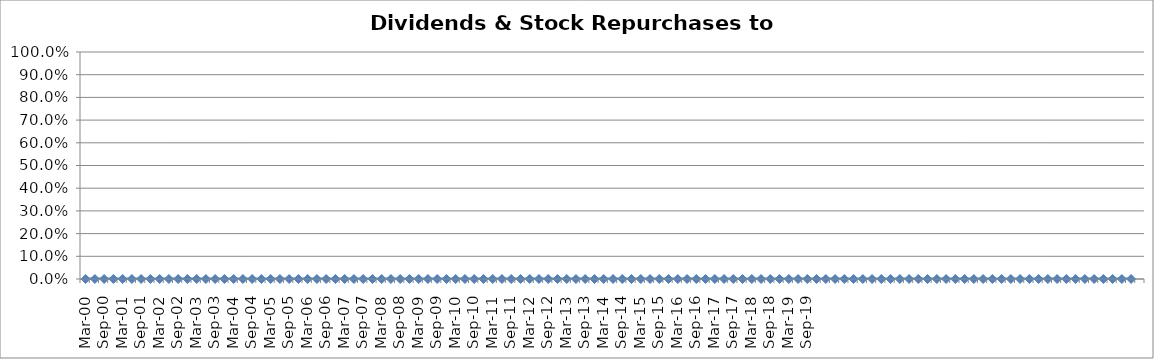
| Category | Dividends & Stock Repurchases to Revenue% |
|---|---|
| Mar-00 | 0 |
| Jun-00 | 0 |
| Sep-00 | 0 |
| Dec-00 | 0 |
| Mar-01 | 0 |
| Jun-01 | 0 |
| Sep-01 | 0 |
| Dec-01 | 0 |
| Mar-02 | 0 |
| Jun-02 | 0 |
| Sep-02 | 0 |
| Dec-02 | 0 |
| Mar-03 | 0 |
| Jun-03 | 0 |
| Sep-03 | 0 |
| Dec-03 | 0 |
| Mar-04 | 0 |
| Jun-04 | 0 |
| Sep-04 | 0 |
| Dec-04 | 0 |
| Mar-05 | 0 |
| Jun-05 | 0 |
| Sep-05 | 0 |
| Dec-05 | 0 |
| Mar-06 | 0 |
| Jun-06 | 0 |
| Sep-06 | 0 |
| Dec-06 | 0 |
| Mar-07 | 0 |
| Jun-07 | 0 |
| Sep-07 | 0 |
| Dec-07 | 0 |
| Mar-08 | 0 |
| Jun-08 | 0 |
| Sep-08 | 0 |
| Dec-08 | 0 |
| Mar-09 | 0 |
| Jun-09 | 0 |
| Sep-09 | 0 |
| Dec-09 | 0 |
| Mar-10 | 0 |
| Jun-10 | 0 |
| Sep-10 | 0 |
| Dec-10 | 0 |
| Mar-11 | 0 |
| Jun-11 | 0 |
| Sep-11 | 0 |
| Dec-11 | 0 |
| Mar-12 | 0 |
| Jun-12 | 0 |
| Sep-12 | 0 |
| Dec-12 | 0 |
| Mar-13 | 0 |
| Jun-13 | 0 |
| Sep-13 | 0 |
| Dec-13 | 0 |
| Mar-14 | 0 |
| Jun-14 | 0 |
| Sep-14 | 0 |
| Dec-14 | 0 |
| Mar-15 | 0 |
| Jun-15 | 0 |
| Sep-15 | 0 |
| Dec-15 | 0 |
| Mar-16 | 0 |
| Jun-16 | 0 |
| Sep-16 | 0 |
| Dec-16 | 0 |
| Mar-17 | 0 |
| Jun-17 | 0 |
| Sep-17 | 0 |
| Dec-17 | 0 |
| Mar-18 | 0 |
| Jun-18 | 0 |
| Sep-18 | 0 |
| Dec-18 | 0 |
| Mar-19 | 0 |
| Jun-19 | 0 |
| Sep-19 | 0 |